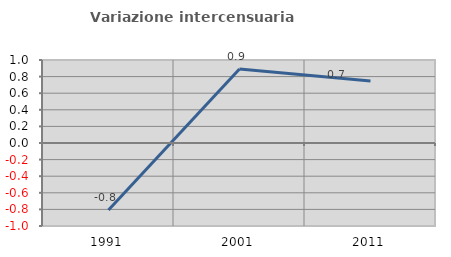
| Category | Variazione intercensuaria annua |
|---|---|
| 1991.0 | -0.807 |
| 2001.0 | 0.892 |
| 2011.0 | 0.747 |